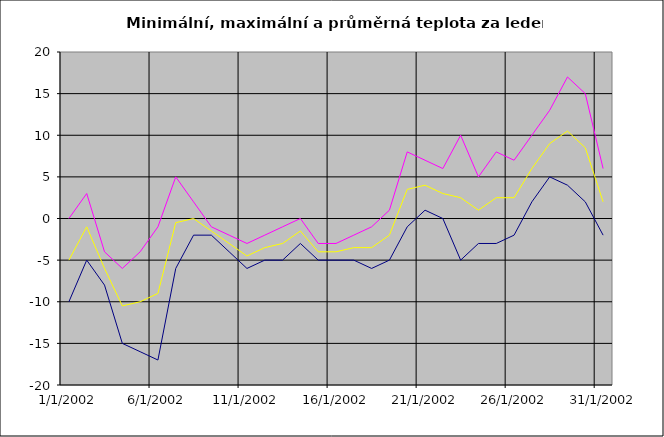
| Category | Series 0 | Series 1 | Series 2 |
|---|---|---|---|
| 2002-01-01 | -10 | 0 | -5 |
| 2002-01-02 | -5 | 3 | -1 |
| 2002-01-03 | -8 | -4 | -6 |
| 2002-01-04 | -15 | -6 | -10.5 |
| 2002-01-05 | -16 | -4 | -10 |
| 2002-01-06 | -17 | -1 | -9 |
| 2002-01-07 | -6 | 5 | -0.5 |
| 2002-01-08 | -2 | 2 | 0 |
| 2002-01-09 | -2 | -1 | -1.5 |
| 2002-01-10 | -4 | -2 | -3 |
| 2002-01-11 | -6 | -3 | -4.5 |
| 2002-01-12 | -5 | -2 | -3.5 |
| 2002-01-13 | -5 | -1 | -3 |
| 2002-01-14 | -3 | 0 | -1.5 |
| 2002-01-15 | -5 | -3 | -4 |
| 2002-01-16 | -5 | -3 | -4 |
| 2002-01-17 | -5 | -2 | -3.5 |
| 2002-01-18 | -6 | -1 | -3.5 |
| 2002-01-19 | -5 | 1 | -2 |
| 2002-01-20 | -1 | 8 | 3.5 |
| 2002-01-21 | 1 | 7 | 4 |
| 2002-01-22 | 0 | 6 | 3 |
| 2002-01-23 | -5 | 10 | 2.5 |
| 2002-01-24 | -3 | 5 | 1 |
| 2002-01-25 | -3 | 8 | 2.5 |
| 2002-01-26 | -2 | 7 | 2.5 |
| 2002-01-27 | 2 | 10 | 6 |
| 2002-01-28 | 5 | 13 | 9 |
| 2002-01-29 | 4 | 17 | 10.5 |
| 2002-01-30 | 2 | 15 | 8.5 |
| 2002-01-31 | -2 | 6 | 2 |